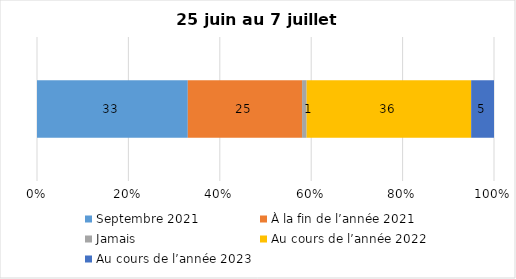
| Category | Septembre 2021 | À la fin de l’année 2021 | Jamais | Au cours de l’année 2022 | Au cours de l’année 2023 |
|---|---|---|---|---|---|
| 0 | 33 | 25 | 1 | 36 | 5 |